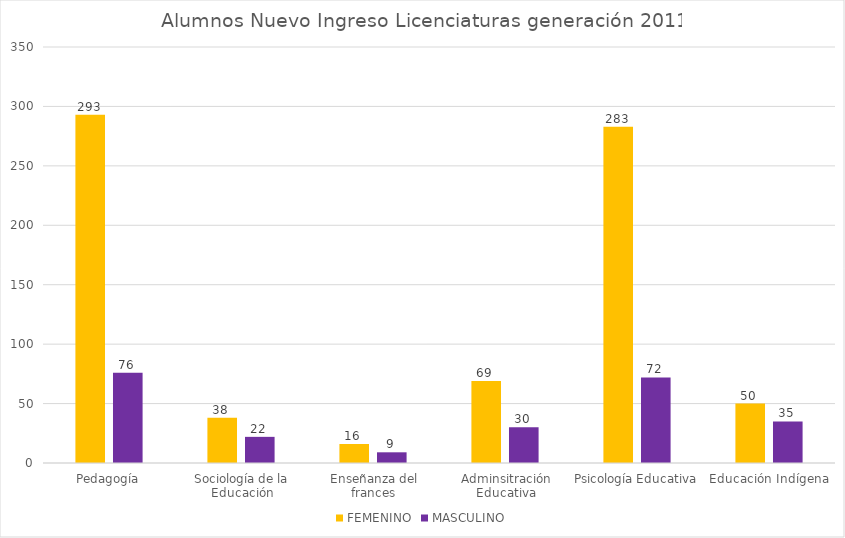
| Category | FEMENINO | MASCULINO |
|---|---|---|
| Pedagogía | 293 | 76 |
| Sociología de la Educación | 38 | 22 |
| Enseñanza del frances | 16 | 9 |
| Adminsitración Educativa | 69 | 30 |
| Psicología Educativa | 283 | 72 |
| Educación Indígena | 50 | 35 |